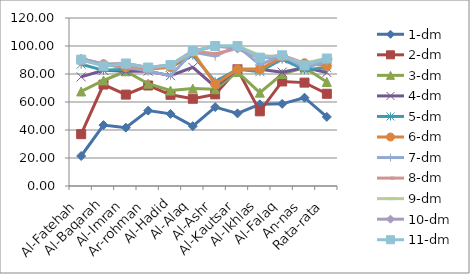
| Category | 1-dm | 2-dm | 3-dm | 4-dm | 5-dm | 6-dm | 7-dm | 8-dm | 9-dm | 10-dm | 11-dm |
|---|---|---|---|---|---|---|---|---|---|---|---|
| Al-Fatehah | 21.429 | 37.013 | 67.532 | 77.922 | 87.013 | 89.61 | 90.909 | 90.909 | 90.909 | 90.909 | 90.26 |
| Al-Baqarah | 43.478 | 72.464 | 75.362 | 82.609 | 82.609 | 86.957 | 86.957 | 86.957 | 86.957 | 86.957 | 85.507 |
| Al-Imran | 41.667 | 65.278 | 81.944 | 81.944 | 83.333 | 84.722 | 84.722 | 84.722 | 87.5 | 87.5 | 87.5 |
| Ar-rohman | 53.846 | 71.795 | 73.077 | 82.051 | 84.615 | 83.333 | 82.051 | 83.333 | 84.615 | 84.615 | 84.615 |
| Al-Hadid | 51.515 | 65.152 | 68.182 | 78.788 | 84.848 | 84.848 | 78.788 | 86.364 | 86.364 | 86.364 | 86.364 |
| Al-Alaq | 42.754 | 62.319 | 69.565 | 84.783 | 93.478 | 95.652 | 95.652 | 96.377 | 95.652 | 96.377 | 96.377 |
| Al-Ashr | 56.364 | 65.455 | 69.091 | 70.909 | 74.545 | 72.727 | 92.727 | 94.545 | 100 | 100 | 100 |
| Al-Kautsar | 51.852 | 83.333 | 81.481 | 83.333 | 83.333 | 83.333 | 100 | 98.148 | 100 | 98.148 | 100 |
| Al-Ikhlas | 58.333 | 53.333 | 66.667 | 83.333 | 81.667 | 83.333 | 86.667 | 91.667 | 93.333 | 91.667 | 91.667 |
| Al-Falaq | 58.667 | 74.667 | 80 | 81.333 | 90.667 | 92 | 93.333 | 93.333 | 92 | 92 | 93.333 |
| An-nas | 63.077 | 73.846 | 84.615 | 84.615 | 83.077 | 87.692 | 84.615 | 87.692 | 87.692 | 86.154 | 86.154 |
| Rata-rata | 49.362 | 65.878 | 74.32 | 81.056 | 84.471 | 85.837 | 88.766 | 90.368 | 91.366 | 90.972 | 91.071 |